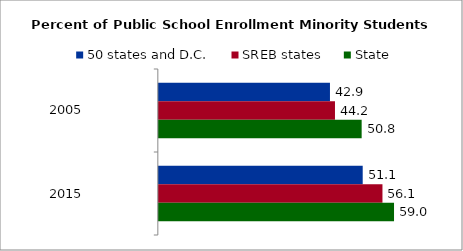
| Category | 50 states and D.C. | SREB states | State |
|---|---|---|---|
| 2005.0 | 42.902 | 44.159 | 50.846 |
| 2015.0 | 51.11 | 56.063 | 58.962 |